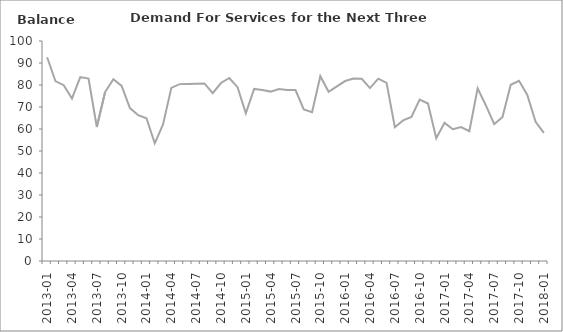
| Category | Balance |
|---|---|
| 2013-01 | 92.6 |
|  | 81.8 |
|  | 79.9 |
| 2013-04 | 73.9 |
|  | 83.6 |
|  | 82.9 |
| 2013-07 | 60.9 |
|  | 76.8 |
|  | 82.6 |
| 2013-10 | 79.6 |
|  | 69.5 |
|  | 66.3 |
| 2014-01 | 64.9 |
|  | 53.5 |
|  | 62.1 |
| 2014-04 | 78.7 |
|  | 80.4 |
|  | 80.5 |
| 2014-07 | 80.6 |
|  | 80.7 |
|  | 76.3 |
| 2014-10 | 80.9 |
|  | 83.2 |
|  | 79 |
| 2015-01 | 67.1 |
|  | 78.2 |
|  | 77.7 |
| 2015-04 | 77 |
|  | 78.2 |
|  | 77.7 |
| 2015-07 | 77.7 |
|  | 68.9 |
|  | 67.6 |
| 2015-10 | 84 |
|  | 76.9 |
|  | 79.4 |
| 2016-01 | 81.8 |
|  | 82.9 |
|  | 82.8 |
| 2016-04 | 78.6 |
|  | 82.9 |
|  | 81 |
| 2016-07 | 60.8 |
|  | 63.9 |
|  | 65.5 |
| 2016-10 | 73.4 |
|  | 71.6 |
|  | 55.8 |
| 2017-01 | 62.8 |
|  | 59.9 |
|  | 60.9 |
| 2017-04 | 59 |
|  | 78.5 |
|  | 70.7 |
| 2017-07 | 62.2 |
|  | 65.4 |
|  | 80.1 |
| 2017-10 | 81.9 |
|  | 75.5 |
|  | 63.3 |
| 2018-01 | 58.2 |